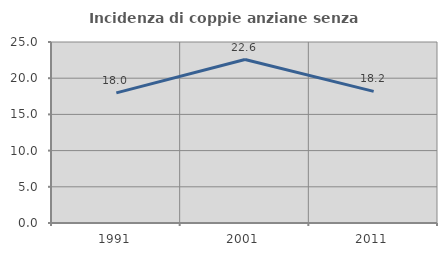
| Category | Incidenza di coppie anziane senza figli  |
|---|---|
| 1991.0 | 17.969 |
| 2001.0 | 22.581 |
| 2011.0 | 18.182 |